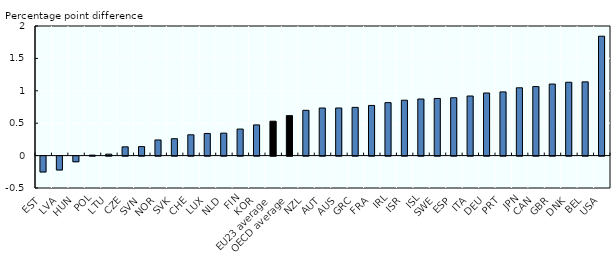
| Category | Series 0 |
|---|---|
| EST | -0.245 |
| LVA | -0.214 |
| HUN | -0.087 |
| POL | 0.007 |
| LTU | 0.022 |
| CZE | 0.135 |
| SVN | 0.139 |
| NOR | 0.241 |
| SVK | 0.261 |
| CHE | 0.321 |
| LUX | 0.342 |
| NLD | 0.347 |
| FIN | 0.41 |
| KOR | 0.474 |
| EU23 average | 0.531 |
| OECD average | 0.617 |
| NZL | 0.699 |
| AUT | 0.734 |
| AUS | 0.735 |
| GRC | 0.744 |
| FRA | 0.774 |
| IRL | 0.817 |
| ISR | 0.855 |
| ISL | 0.873 |
| SWE | 0.882 |
| ESP | 0.893 |
| ITA | 0.92 |
| DEU | 0.966 |
| PRT | 0.983 |
| JPN | 1.046 |
| CAN | 1.065 |
| GBR | 1.104 |
| DNK | 1.132 |
| BEL | 1.138 |
| USA | 1.842 |